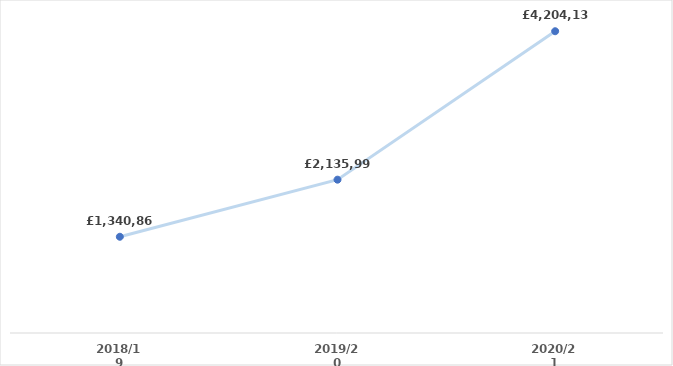
| Category | Series 0 |
|---|---|
| 2018/19 | 1340866 |
| 2019/20 | 2135994 |
| 2020/21 | 4204132.577 |